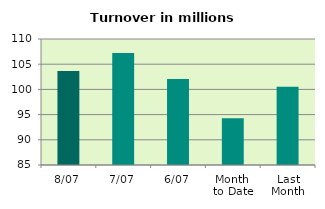
| Category | Series 0 |
|---|---|
| 8/07 | 103.638 |
| 7/07 | 107.238 |
| 6/07 | 102.042 |
| Month 
to Date | 94.279 |
| Last
Month | 100.537 |